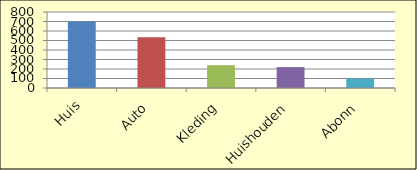
| Category | Series 0 |
|---|---|
| Huis | 700 |
| Auto | 535 |
| Kleding | 240 |
| Huishouden | 220 |
| Abonn | 100 |